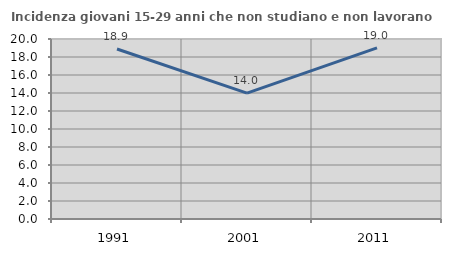
| Category | Incidenza giovani 15-29 anni che non studiano e non lavorano  |
|---|---|
| 1991.0 | 18.889 |
| 2001.0 | 13.986 |
| 2011.0 | 19.023 |